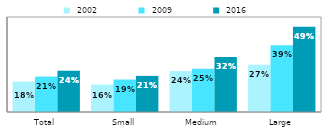
| Category |  2002 |  2009 |  2016 |
|---|---|---|---|
| Total | 0.176 | 0.205 | 0.239 |
| Small | 0.159 | 0.188 | 0.209 |
| Medium | 0.237 | 0.25 | 0.318 |
| Large | 0.273 | 0.387 | 0.493 |